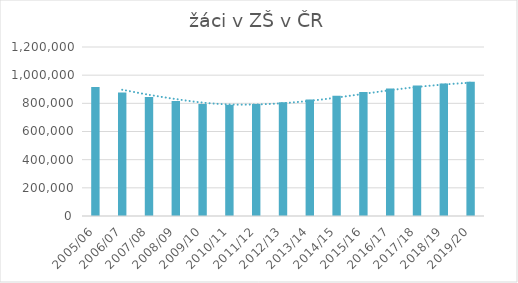
| Category | žáci v ZŠ v ČR |
|---|---|
| 2005/06 | 916575 |
| 2006/07 | 876513 |
| 2007/08 | 844863 |
| 2008/09 | 816015 |
| 2009/10 | 794459 |
| 2010/11 | 789486 |
| 2011/12 | 794642 |
| 2012/13 | 807950 |
| 2013/14 | 827654 |
| 2014/15 | 854137 |
| 2015/16 | 880251 |
| 2016/17 | 906188 |
| 2017/18 | 926108 |
| 2018/19 | 940928 |
| 2019/20 | 952946 |